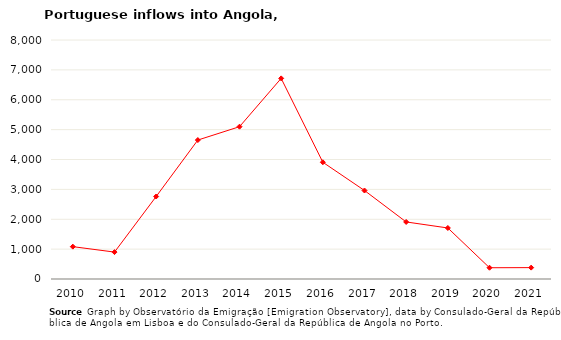
| Category | Entradas |
|---|---|
| 2010.0 | 1083 |
| 2011.0 | 901 |
| 2012.0 | 2761 |
| 2013.0 | 4651 |
| 2014.0 | 5098 |
| 2015.0 | 6715 |
| 2016.0 | 3908 |
| 2017.0 | 2962 |
| 2018.0 | 1910 |
| 2019.0 | 1708 |
| 2020.0 | 377 |
| 2021.0 | 381 |